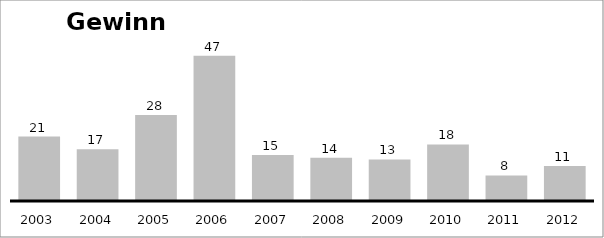
| Category | Gewinn |
|---|---|
| 2003.0 | 20798 |
| 2004.0 | 16680 |
| 2005.0 | 27717 |
| 2006.0 | 46836 |
| 2007.0 | 14810 |
| 2008.0 | 13921 |
| 2009.0 | 13414 |
| 2010.0 | 18256 |
| 2011.0 | 8235 |
| 2012.0 | 11273 |